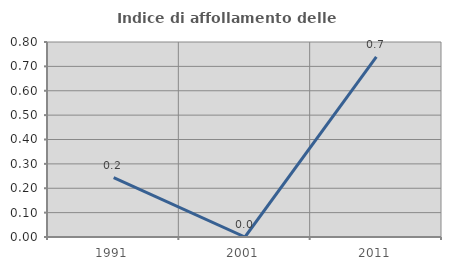
| Category | Indice di affollamento delle abitazioni  |
|---|---|
| 1991.0 | 0.243 |
| 2001.0 | 0 |
| 2011.0 | 0.739 |